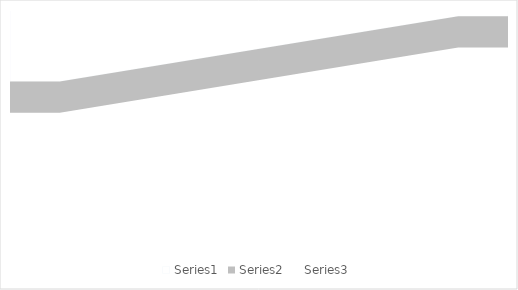
| Category | Series1 | Series2 | Series3 |
|---|---|---|---|
| 0.0 | 570 | 250 | 1110 |
| 10.0 | 570 | 250 | 1110 |
| 90.0 | 50 | 250 | 1630 |
| 100.0 | 50 | 250 | 1630 |